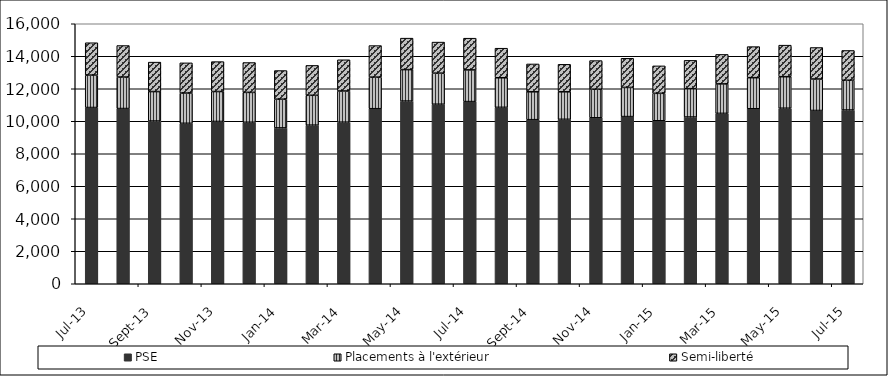
| Category | PSE | Placements à l'extérieur | Semi-liberté |
|---|---|---|---|
| 2013-07-01 | 10846 | 1993 | 1993 |
| 2013-08-01 | 10782 | 1939 | 1939 |
| 2013-09-01 | 10013 | 1813 | 1813 |
| 2013-10-01 | 9874 | 1860 | 1860 |
| 2013-11-01 | 9987 | 1842 | 1842 |
| 2013-12-01 | 9938 | 1838 | 1838 |
| 2014-01-01 | 9591 | 1765 | 1765 |
| 2014-02-01 | 9760 | 1838 | 1838 |
| 2014-03-01 | 9943 | 1920 | 1920 |
| 2014-04-01 | 10773 | 1942 | 1942 |
| 2014-05-01 | 11241 | 1937 | 1937 |
| 2014-06-01 | 11048 | 1912 | 1912 |
| 2014-07-01 | 11210 | 1951 | 1951 |
| 2014-08-01 | 10856 | 1820 | 1820 |
| 2014-09-01 | 10098 | 1714 | 1714 |
| 2014-10-01 | 10120 | 1692 | 1692 |
| 2014-11-01 | 10213 | 1760 | 1760 |
| 2014-12-01 | 10287 | 1794 | 1794 |
| 2015-01-01 | 10030 | 1689 | 1689 |
| 2015-02-01 | 10261 | 1743 | 1743 |
| 2015-03-01 | 10485 | 1814 | 1814 |
| 2015-04-01 | 10770 | 1912 | 1912 |
| 2015-05-01 | 10801 | 1941 | 1941 |
| 2015-06-01 | 10662 | 1938 | 1938 |
| 2015-07-01 | 10692 | 1832 | 1832 |